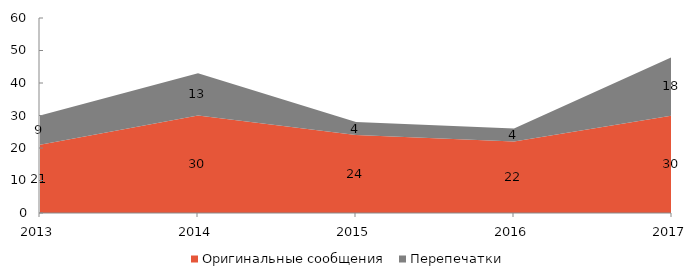
| Category | Оригинальные сообщения | Перепечатки |
|---|---|---|
| 2013 | 21 | 9 |
| 2014 | 30 | 13 |
| 2015 | 24 | 4 |
| 2016 | 22 | 4 |
| 2017 | 30 | 18 |